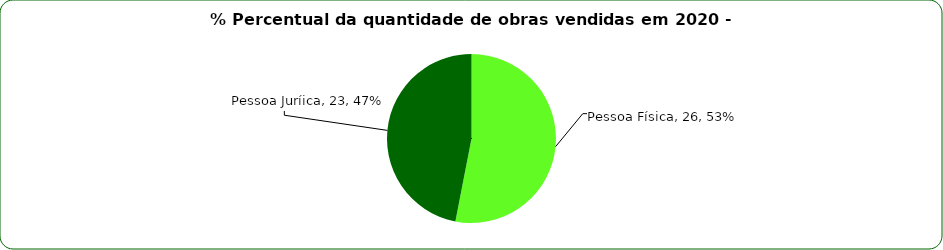
| Category | Series 0 |
|---|---|
| Pessoa Física | 26 |
| Pessoa Juríica | 23 |